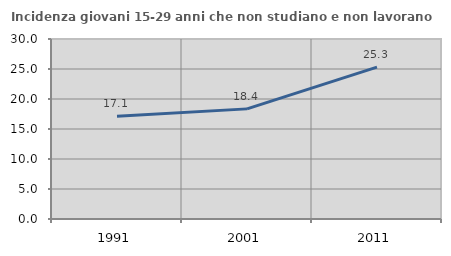
| Category | Incidenza giovani 15-29 anni che non studiano e non lavorano  |
|---|---|
| 1991.0 | 17.129 |
| 2001.0 | 18.354 |
| 2011.0 | 25.301 |